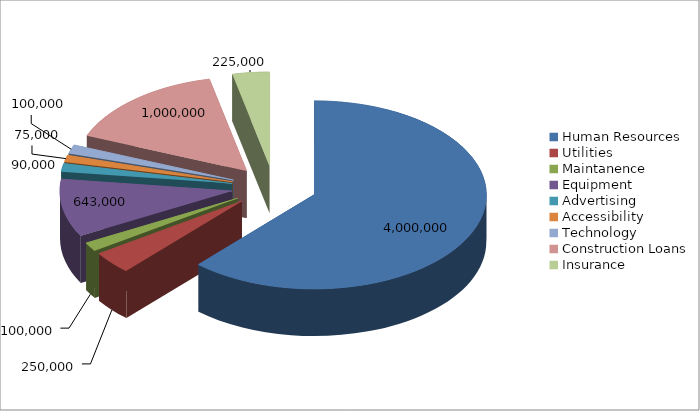
| Category | Series 0 |
|---|---|
| Human Resources | 4000000 |
| Utilities | 250000 |
| Maintanence | 100000 |
| Equipment | 643000 |
| Advertising | 90000 |
| Accessibility | 75000 |
| Technology | 100000 |
| Construction Loans | 1000000 |
| Insurance | 225000 |